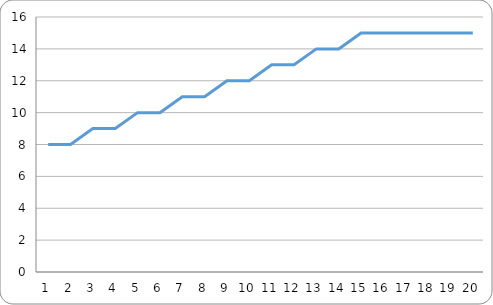
| Category | fair |
|---|---|
| 0 | 8 |
| 1 | 8 |
| 2 | 9 |
| 3 | 9 |
| 4 | 10 |
| 5 | 10 |
| 6 | 11 |
| 7 | 11 |
| 8 | 12 |
| 9 | 12 |
| 10 | 13 |
| 11 | 13 |
| 12 | 14 |
| 13 | 14 |
| 14 | 15 |
| 15 | 15 |
| 16 | 15 |
| 17 | 15 |
| 18 | 15 |
| 19 | 15 |